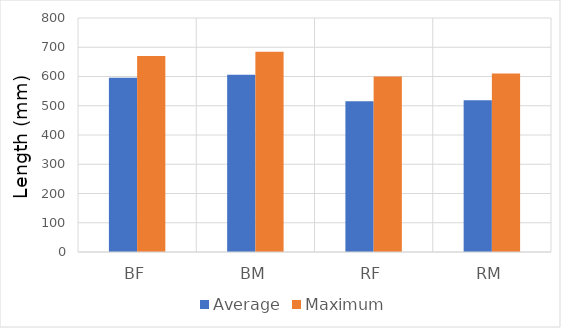
| Category | Average | Maximum |
|---|---|---|
| BF | 596 | 670 |
| BM | 606 | 685 |
| RF | 515 | 600 |
| RM | 519 | 610 |